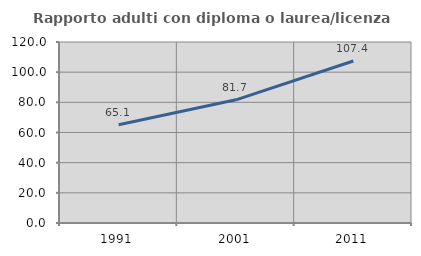
| Category | Rapporto adulti con diploma o laurea/licenza media  |
|---|---|
| 1991.0 | 65.147 |
| 2001.0 | 81.663 |
| 2011.0 | 107.412 |